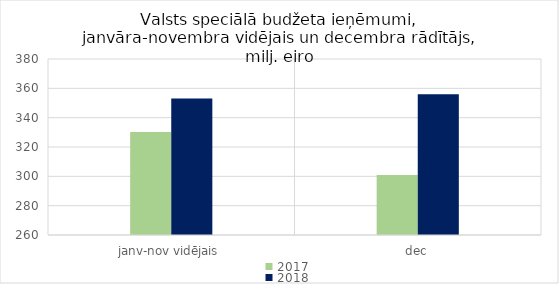
| Category | 2017 | 2018 |
|---|---|---|
| janv-nov vidējais | 330199.424 | 353066.095 |
| dec | 300963.059 | 355952.142 |